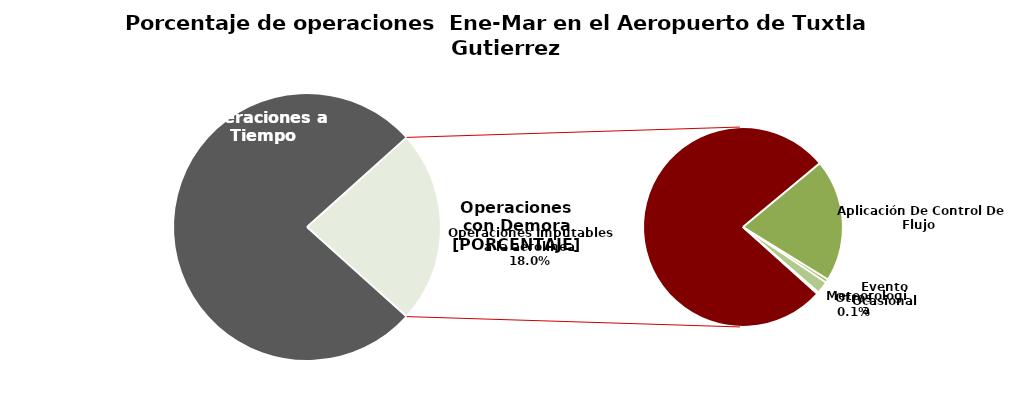
| Category | Series 0 |
|---|---|
| Operaciones a Tiempo | 2306 |
| Operaciones Imputables a la aerolínea | 542 |
| Aplicación De Control De Flujo  | 139 |
| Evento Ocasional | 4 |
| Meteorologia | 14 |
| Otros | 2 |